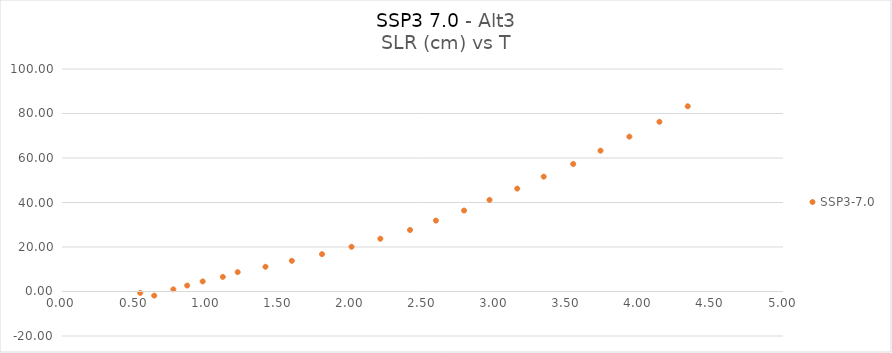
| Category | SSP3-7.0 |
|---|---|
| 0.639593181 | -1.853 |
| 0.542364652 | -0.626 |
| 0.772130534 | 0.958 |
| 0.868150926 | 2.678 |
| 0.975561417 | 4.531 |
| 1.115356613 | 6.565 |
| 1.218373475 | 8.703 |
| 1.410985436 | 11.118 |
| 1.593999848 | 13.794 |
| 1.803244946 | 16.789 |
| 2.007931221 | 20.098 |
| 2.207668083 | 23.715 |
| 2.413604456 | 27.658 |
| 2.592938574 | 31.869 |
| 2.788230632 | 36.386 |
| 2.964937005 | 41.167 |
| 3.15697426 | 46.248 |
| 3.340696123 | 51.61 |
| 3.545030632 | 57.303 |
| 3.734403966 | 63.293 |
| 3.934582593 | 69.607 |
| 4.14293573 | 76.265 |
| 4.339364848 | 83.24 |